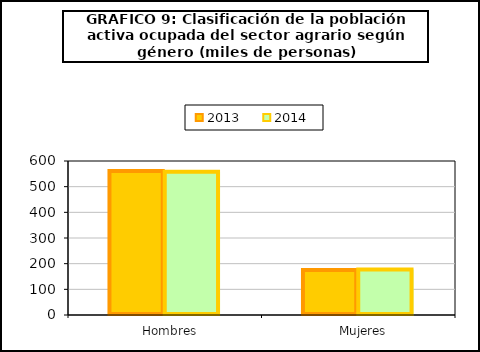
| Category | 2013 | 2014 |
|---|---|---|
|    Hombres | 561.1 | 558.4 |
|    Mujeres | 175.45 | 177.4 |